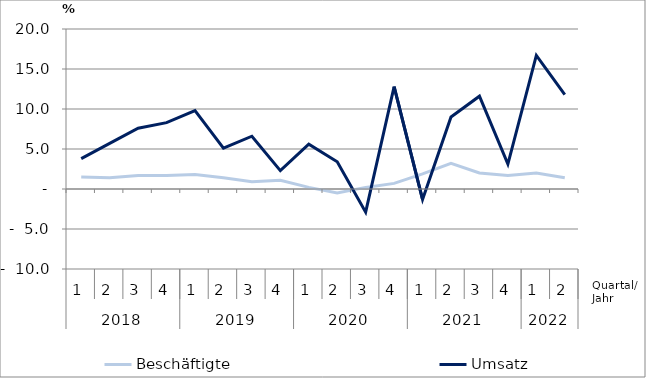
| Category | Beschäftigte | Umsatz |
|---|---|---|
| 0 | 1.5 | 3.8 |
| 1 | 1.4 | 5.7 |
| 2 | 1.7 | 7.6 |
| 3 | 1.7 | 8.3 |
| 4 | 1.8 | 9.8 |
| 5 | 1.4 | 5.1 |
| 6 | 0.9 | 6.6 |
| 7 | 1.1 | 2.3 |
| 8 | 0.2 | 5.6 |
| 9 | -0.5 | 3.4 |
| 10 | 0.2 | -2.9 |
| 11 | 0.7 | 12.8 |
| 12 | 1.9 | -1.3 |
| 13 | 3.2 | 9 |
| 14 | 2 | 11.6 |
| 15 | 1.7 | 3.1 |
| 16 | 2 | 16.7 |
| 17 | 1.4 | 11.8 |